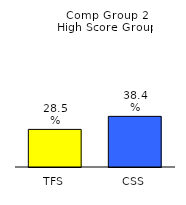
| Category | Series 0 |
|---|---|
| TFS | 0.285 |
| CSS | 0.384 |